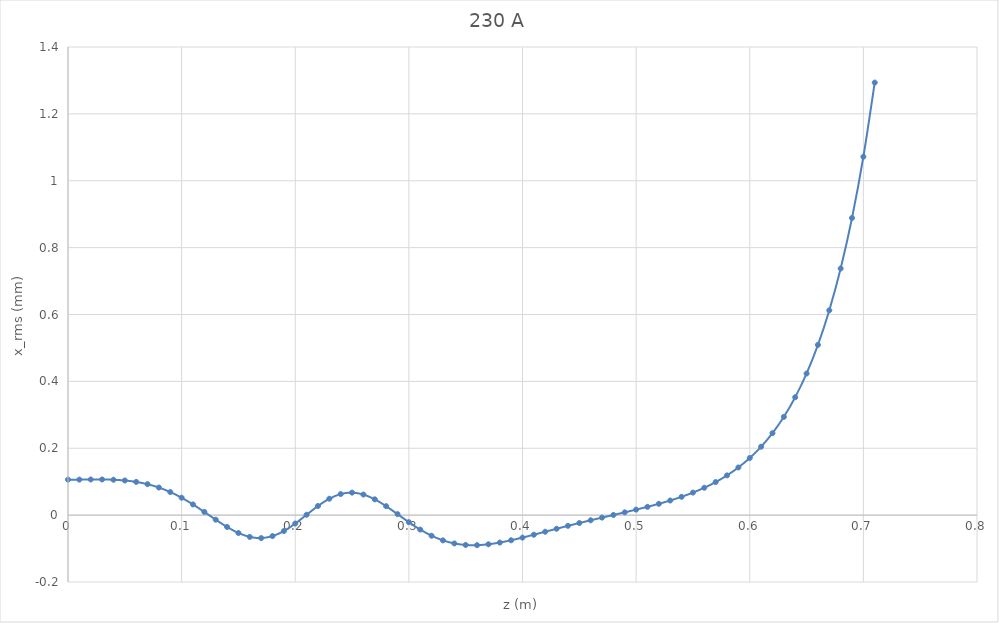
| Category | Series 0 |
|---|---|
| 0.0 | 0.106 |
| 0.01 | 0.106 |
| 0.02 | 0.107 |
| 0.03 | 0.107 |
| 0.04 | 0.106 |
| 0.05 | 0.104 |
| 0.06 | 0.099 |
| 0.07 | 0.093 |
| 0.08 | 0.083 |
| 0.09 | 0.069 |
| 0.1 | 0.052 |
| 0.11 | 0.032 |
| 0.12 | 0.01 |
| 0.13 | -0.014 |
| 0.14 | -0.035 |
| 0.15 | -0.053 |
| 0.16 | -0.065 |
| 0.17 | -0.069 |
| 0.18 | -0.063 |
| 0.19 | -0.048 |
| 0.2 | -0.025 |
| 0.21 | 0.001 |
| 0.22 | 0.027 |
| 0.23 | 0.049 |
| 0.24 | 0.063 |
| 0.25 | 0.067 |
| 0.26 | 0.062 |
| 0.27 | 0.047 |
| 0.28 | 0.027 |
| 0.29 | 0.003 |
| 0.3 | -0.021 |
| 0.31 | -0.043 |
| 0.32 | -0.062 |
| 0.33 | -0.076 |
| 0.34 | -0.085 |
| 0.35 | -0.089 |
| 0.36 | -0.09 |
| 0.37 | -0.087 |
| 0.38 | -0.082 |
| 0.39 | -0.075 |
| 0.4 | -0.067 |
| 0.41 | -0.059 |
| 0.42 | -0.05 |
| 0.43 | -0.041 |
| 0.44 | -0.032 |
| 0.45 | -0.024 |
| 0.46 | -0.015 |
| 0.47 | -0.007 |
| 0.48 | 0 |
| 0.49 | 0.008 |
| 0.5 | 0.016 |
| 0.51 | 0.025 |
| 0.52 | 0.034 |
| 0.53 | 0.044 |
| 0.54 | 0.055 |
| 0.55 | 0.067 |
| 0.56 | 0.082 |
| 0.57 | 0.099 |
| 0.58 | 0.119 |
| 0.59 | 0.143 |
| 0.6 | 0.171 |
| 0.61 | 0.205 |
| 0.62 | 0.245 |
| 0.63 | 0.294 |
| 0.64 | 0.353 |
| 0.65 | 0.423 |
| 0.66 | 0.509 |
| 0.67 | 0.612 |
| 0.68 | 0.737 |
| 0.69 | 0.889 |
| 0.7 | 1.072 |
| 0.71 | 1.294 |